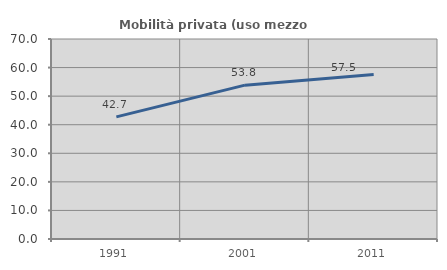
| Category | Mobilità privata (uso mezzo privato) |
|---|---|
| 1991.0 | 42.737 |
| 2001.0 | 53.849 |
| 2011.0 | 57.54 |